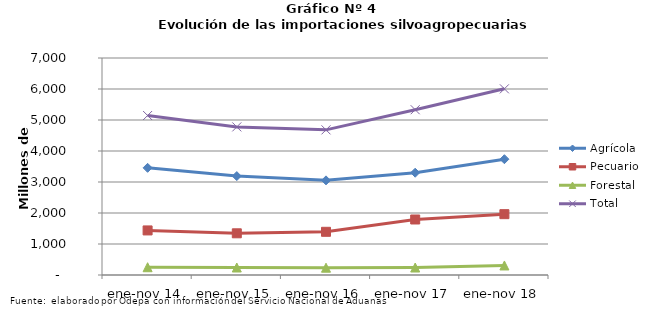
| Category | Agrícola | Pecuario | Forestal | Total |
|---|---|---|---|---|
| ene-nov 14 | 3456794 | 1437571 | 250639 | 5145004 |
| ene-nov 15 | 3190598 | 1344969 | 241847 | 4777414 |
| ene-nov 16 | 3052610 | 1393322 | 235879 | 4681811 |
| ene-nov 17 | 3299665 | 1790637 | 241068 | 5331370 |
| ene-nov 18 | 3735520 | 1962340 | 307562 | 6005422 |